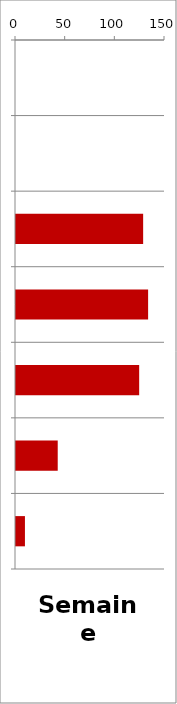
| Category | PL |
|---|---|
| 0 | 0 |
| 1 | 0 |
| 2 | 128 |
| 3 | 133 |
| 4 | 124 |
| 5 | 42 |
| 6 | 9 |